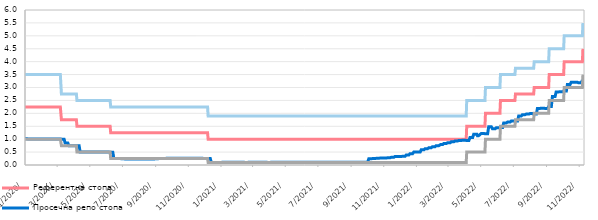
| Category | Референтна стопа | Просечна репо стопа | Каматна стопа на кредитне олакшице | Каматна стопа на депозитне олакшице |
|---|---|---|---|---|
| 2020-01-03 | 2.25 | 1.02 | 3.5 | 1 |
| 2020-01-06 | 2.25 | 1.02 | 3.5 | 1 |
| 2020-01-08 | 2.25 | 1.01 | 3.5 | 1 |
| 2020-01-09 | 2.25 | 1.01 | 3.5 | 1 |
| 2020-01-10 | 2.25 | 1.01 | 3.5 | 1 |
| 2020-01-13 | 2.25 | 1.01 | 3.5 | 1 |
| 2020-01-14 | 2.25 | 1.01 | 3.5 | 1 |
| 2020-01-15 | 2.25 | 1.01 | 3.5 | 1 |
| 2020-01-16 | 2.25 | 1.01 | 3.5 | 1 |
| 2020-01-17 | 2.25 | 1.01 | 3.5 | 1 |
| 2020-01-20 | 2.25 | 1.01 | 3.5 | 1 |
| 2020-01-21 | 2.25 | 1.01 | 3.5 | 1 |
| 2020-01-22 | 2.25 | 1.01 | 3.5 | 1 |
| 2020-01-23 | 2.25 | 1.01 | 3.5 | 1 |
| 2020-01-24 | 2.25 | 1.01 | 3.5 | 1 |
| 2020-01-27 | 2.25 | 1.01 | 3.5 | 1 |
| 2020-01-28 | 2.25 | 1.01 | 3.5 | 1 |
| 2020-01-29 | 2.25 | 1.01 | 3.5 | 1 |
| 2020-01-30 | 2.25 | 1.01 | 3.5 | 1 |
| 2020-01-31 | 2.25 | 1.01 | 3.5 | 1 |
| 2020-02-03 | 2.25 | 1.01 | 3.5 | 1 |
| 2020-02-04 | 2.25 | 1.01 | 3.5 | 1 |
| 2020-02-05 | 2.25 | 1.01 | 3.5 | 1 |
| 2020-02-06 | 2.25 | 1.01 | 3.5 | 1 |
| 2020-02-07 | 2.25 | 1.01 | 3.5 | 1 |
| 2020-02-10 | 2.25 | 1.01 | 3.5 | 1 |
| 2020-02-11 | 2.25 | 1.01 | 3.5 | 1 |
| 2020-02-12 | 2.25 | 1.01 | 3.5 | 1 |
| 2020-02-13 | 2.25 | 1.01 | 3.5 | 1 |
| 2020-02-14 | 2.25 | 1.01 | 3.5 | 1 |
| 2020-02-18 | 2.25 | 1.01 | 3.5 | 1 |
| 2020-02-19 | 2.25 | 1.01 | 3.5 | 1 |
| 2020-02-20 | 2.25 | 1.01 | 3.5 | 1 |
| 2020-02-21 | 2.25 | 1.01 | 3.5 | 1 |
| 2020-02-24 | 2.25 | 1.01 | 3.5 | 1 |
| 2020-02-25 | 2.25 | 1.01 | 3.5 | 1 |
| 2020-02-26 | 2.25 | 1.01 | 3.5 | 1 |
| 2020-02-27 | 2.25 | 1.01 | 3.5 | 1 |
| 2020-02-28 | 2.25 | 1.01 | 3.5 | 1 |
| 2020-03-02 | 2.25 | 1.01 | 3.5 | 1 |
| 2020-03-03 | 2.25 | 1.01 | 3.5 | 1 |
| 2020-03-04 | 2.25 | 1.01 | 3.5 | 1 |
| 2020-03-05 | 2.25 | 1.01 | 3.5 | 1 |
| 2020-03-06 | 2.25 | 1.01 | 3.5 | 1 |
| 2020-03-09 | 2.25 | 1.01 | 3.5 | 1 |
| 2020-03-10 | 2.25 | 1.01 | 3.5 | 1 |
| 2020-03-11 | 1.75 | 1 | 2.75 | 0.75 |
| 2020-03-12 | 1.75 | 1 | 2.75 | 0.75 |
| 2020-03-13 | 1.75 | 1 | 2.75 | 0.75 |
| 2020-03-16 | 1.75 | 1 | 2.75 | 0.75 |
| 2020-03-17 | 1.75 | 1 | 2.75 | 0.75 |
| 2020-03-18 | 1.75 | 0.85 | 2.75 | 0.75 |
| 2020-03-19 | 1.75 | 0.85 | 2.75 | 0.75 |
| 2020-03-20 | 1.75 | 0.85 | 2.75 | 0.75 |
| 2020-03-23 | 1.75 | 0.85 | 2.75 | 0.75 |
| 2020-03-24 | 1.75 | 0.85 | 2.75 | 0.75 |
| 2020-03-25 | 1.75 | 0.75 | 2.75 | 0.75 |
| 2020-03-26 | 1.75 | 0.75 | 2.75 | 0.75 |
| 2020-03-27 | 1.75 | 0.75 | 2.75 | 0.75 |
| 2020-03-30 | 1.75 | 0.75 | 2.75 | 0.75 |
| 2020-03-31 | 1.75 | 0.75 | 2.75 | 0.75 |
| 2020-04-01 | 1.75 | 0.75 | 2.75 | 0.75 |
| 2020-04-02 | 1.75 | 0.75 | 2.75 | 0.75 |
| 2020-04-03 | 1.75 | 0.75 | 2.75 | 0.75 |
| 2020-04-06 | 1.75 | 0.75 | 2.75 | 0.75 |
| 2020-04-07 | 1.75 | 0.75 | 2.75 | 0.75 |
| 2020-04-08 | 1.75 | 0.75 | 2.75 | 0.75 |
| 2020-04-09 | 1.5 | 0.75 | 2.5 | 0.5 |
| 2020-04-10 | 1.5 | 0.75 | 2.5 | 0.5 |
| 2020-04-13 | 1.5 | 0.75 | 2.5 | 0.5 |
| 2020-04-14 | 1.5 | 0.75 | 2.5 | 0.5 |
| 2020-04-15 | 1.5 | 0.5 | 2.5 | 0.5 |
| 2020-04-16 | 1.5 | 0.5 | 2.5 | 0.5 |
| 2020-04-21 | 1.5 | 0.5 | 2.5 | 0.5 |
| 2020-04-22 | 1.5 | 0.5 | 2.5 | 0.5 |
| 2020-04-23 | 1.5 | 0.5 | 2.5 | 0.5 |
| 2020-04-24 | 1.5 | 0.5 | 2.5 | 0.5 |
| 2020-04-27 | 1.5 | 0.5 | 2.5 | 0.5 |
| 2020-04-28 | 1.5 | 0.5 | 2.5 | 0.5 |
| 2020-04-29 | 1.5 | 0.5 | 2.5 | 0.5 |
| 2020-04-30 | 1.5 | 0.5 | 2.5 | 0.5 |
| 2020-05-04 | 1.5 | 0.5 | 2.5 | 0.5 |
| 2020-05-05 | 1.5 | 0.5 | 2.5 | 0.5 |
| 2020-05-06 | 1.5 | 0.5 | 2.5 | 0.5 |
| 2020-05-07 | 1.5 | 0.5 | 2.5 | 0.5 |
| 2020-05-08 | 1.5 | 0.5 | 2.5 | 0.5 |
| 2020-05-11 | 1.5 | 0.5 | 2.5 | 0.5 |
| 2020-05-12 | 1.5 | 0.5 | 2.5 | 0.5 |
| 2020-05-13 | 1.5 | 0.5 | 2.5 | 0.5 |
| 2020-05-14 | 1.5 | 0.5 | 2.5 | 0.5 |
| 2020-05-15 | 1.5 | 0.5 | 2.5 | 0.5 |
| 2020-05-18 | 1.5 | 0.5 | 2.5 | 0.5 |
| 2020-05-19 | 1.5 | 0.5 | 2.5 | 0.5 |
| 2020-05-20 | 1.5 | 0.5 | 2.5 | 0.5 |
| 2020-05-21 | 1.5 | 0.5 | 2.5 | 0.5 |
| 2020-05-22 | 1.5 | 0.5 | 2.5 | 0.5 |
| 2020-05-25 | 1.5 | 0.5 | 2.5 | 0.5 |
| 2020-05-26 | 1.5 | 0.5 | 2.5 | 0.5 |
| 2020-05-27 | 1.5 | 0.5 | 2.5 | 0.5 |
| 2020-05-28 | 1.5 | 0.5 | 2.5 | 0.5 |
| 2020-05-29 | 1.5 | 0.5 | 2.5 | 0.5 |
| 2020-06-01 | 1.5 | 0.5 | 2.5 | 0.5 |
| 2020-06-02 | 1.5 | 0.5 | 2.5 | 0.5 |
| 2020-06-03 | 1.5 | 0.5 | 2.5 | 0.5 |
| 2020-06-04 | 1.5 | 0.5 | 2.5 | 0.5 |
| 2020-06-05 | 1.5 | 0.5 | 2.5 | 0.5 |
| 2020-06-08 | 1.5 | 0.5 | 2.5 | 0.5 |
| 2020-06-09 | 1.5 | 0.5 | 2.5 | 0.5 |
| 2020-06-10 | 1.5 | 0.49 | 2.5 | 0.5 |
| 2020-06-11 | 1.25 | 0.49 | 2.25 | 0.25 |
| 2020-06-12 | 1.25 | 0.49 | 2.25 | 0.25 |
| 2020-06-15 | 1.25 | 0.49 | 2.25 | 0.25 |
| 2020-06-16 | 1.25 | 0.49 | 2.25 | 0.25 |
| 2020-06-17 | 1.25 | 0.25 | 2.25 | 0.25 |
| 2020-06-18 | 1.25 | 0.25 | 2.25 | 0.25 |
| 2020-06-19 | 1.25 | 0.25 | 2.25 | 0.25 |
| 2020-06-22 | 1.25 | 0.25 | 2.25 | 0.25 |
| 2020-06-23 | 1.25 | 0.25 | 2.25 | 0.25 |
| 2020-06-24 | 1.25 | 0.25 | 2.25 | 0.25 |
| 2020-06-25 | 1.25 | 0.25 | 2.25 | 0.25 |
| 2020-06-26 | 1.25 | 0.25 | 2.25 | 0.25 |
| 2020-06-29 | 1.25 | 0.25 | 2.25 | 0.25 |
| 2020-06-30 | 1.25 | 0.25 | 2.25 | 0.25 |
| 2020-07-01 | 1.25 | 0.24 | 2.25 | 0.25 |
| 2020-07-02 | 1.25 | 0.24 | 2.25 | 0.25 |
| 2020-07-03 | 1.25 | 0.24 | 2.25 | 0.25 |
| 2020-07-06 | 1.25 | 0.24 | 2.25 | 0.25 |
| 2020-07-07 | 1.25 | 0.24 | 2.25 | 0.25 |
| 2020-07-08 | 1.25 | 0.23 | 2.25 | 0.25 |
| 2020-07-09 | 1.25 | 0.23 | 2.25 | 0.25 |
| 2020-07-10 | 1.25 | 0.23 | 2.25 | 0.25 |
| 2020-07-13 | 1.25 | 0.23 | 2.25 | 0.25 |
| 2020-07-14 | 1.25 | 0.23 | 2.25 | 0.25 |
| 2020-07-15 | 1.25 | 0.23 | 2.25 | 0.25 |
| 2020-07-16 | 1.25 | 0.23 | 2.25 | 0.25 |
| 2020-07-17 | 1.25 | 0.23 | 2.25 | 0.25 |
| 2020-07-20 | 1.25 | 0.23 | 2.25 | 0.25 |
| 2020-07-21 | 1.25 | 0.23 | 2.25 | 0.25 |
| 2020-07-22 | 1.25 | 0.23 | 2.25 | 0.25 |
| 2020-07-23 | 1.25 | 0.23 | 2.25 | 0.25 |
| 2020-07-24 | 1.25 | 0.23 | 2.25 | 0.25 |
| 2020-07-27 | 1.25 | 0.23 | 2.25 | 0.25 |
| 2020-07-28 | 1.25 | 0.23 | 2.25 | 0.25 |
| 2020-07-29 | 1.25 | 0.23 | 2.25 | 0.25 |
| 2020-07-30 | 1.25 | 0.23 | 2.25 | 0.25 |
| 2020-07-31 | 1.25 | 0.23 | 2.25 | 0.25 |
| 2020-08-03 | 1.25 | 0.23 | 2.25 | 0.25 |
| 2020-08-04 | 1.25 | 0.23 | 2.25 | 0.25 |
| 2020-08-05 | 1.25 | 0.23 | 2.25 | 0.25 |
| 2020-08-06 | 1.25 | 0.23 | 2.25 | 0.25 |
| 2020-08-07 | 1.25 | 0.23 | 2.25 | 0.25 |
| 2020-08-10 | 1.25 | 0.23 | 2.25 | 0.25 |
| 2020-08-11 | 1.25 | 0.23 | 2.25 | 0.25 |
| 2020-08-12 | 1.25 | 0.23 | 2.25 | 0.25 |
| 2020-08-13 | 1.25 | 0.23 | 2.25 | 0.25 |
| 2020-08-14 | 1.25 | 0.23 | 2.25 | 0.25 |
| 2020-08-17 | 1.25 | 0.23 | 2.25 | 0.25 |
| 2020-08-18 | 1.25 | 0.23 | 2.25 | 0.25 |
| 2020-08-19 | 1.25 | 0.23 | 2.25 | 0.25 |
| 2020-08-20 | 1.25 | 0.23 | 2.25 | 0.25 |
| 2020-08-21 | 1.25 | 0.23 | 2.25 | 0.25 |
| 2020-08-24 | 1.25 | 0.23 | 2.25 | 0.25 |
| 2020-08-25 | 1.25 | 0.23 | 2.25 | 0.25 |
| 2020-08-26 | 1.25 | 0.23 | 2.25 | 0.25 |
| 2020-08-27 | 1.25 | 0.23 | 2.25 | 0.25 |
| 2020-08-28 | 1.25 | 0.23 | 2.25 | 0.25 |
| 2020-08-31 | 1.25 | 0.23 | 2.25 | 0.25 |
| 2020-09-01 | 1.25 | 0.23 | 2.25 | 0.25 |
| 2020-09-02 | 1.25 | 0.24 | 2.25 | 0.25 |
| 2020-09-03 | 1.25 | 0.24 | 2.25 | 0.25 |
| 2020-09-04 | 1.25 | 0.24 | 2.25 | 0.25 |
| 2020-09-07 | 1.25 | 0.24 | 2.25 | 0.25 |
| 2020-09-08 | 1.25 | 0.24 | 2.25 | 0.25 |
| 2020-09-09 | 1.25 | 0.25 | 2.25 | 0.25 |
| 2020-09-10 | 1.25 | 0.25 | 2.25 | 0.25 |
| 2020-09-11 | 1.25 | 0.25 | 2.25 | 0.25 |
| 2020-09-14 | 1.25 | 0.25 | 2.25 | 0.25 |
| 2020-09-15 | 1.25 | 0.25 | 2.25 | 0.25 |
| 2020-09-16 | 1.25 | 0.25 | 2.25 | 0.25 |
| 2020-09-17 | 1.25 | 0.25 | 2.25 | 0.25 |
| 2020-09-18 | 1.25 | 0.25 | 2.25 | 0.25 |
| 2020-09-21 | 1.25 | 0.25 | 2.25 | 0.25 |
| 2020-09-22 | 1.25 | 0.25 | 2.25 | 0.25 |
| 2020-09-23 | 1.25 | 0.26 | 2.25 | 0.25 |
| 2020-09-24 | 1.25 | 0.26 | 2.25 | 0.25 |
| 2020-09-25 | 1.25 | 0.26 | 2.25 | 0.25 |
| 2020-09-28 | 1.25 | 0.26 | 2.25 | 0.25 |
| 2020-09-29 | 1.25 | 0.26 | 2.25 | 0.25 |
| 2020-09-30 | 1.25 | 0.26 | 2.25 | 0.25 |
| 2020-10-01 | 1.25 | 0.26 | 2.25 | 0.25 |
| 2020-10-02 | 1.25 | 0.26 | 2.25 | 0.25 |
| 2020-10-05 | 1.25 | 0.26 | 2.25 | 0.25 |
| 2020-10-06 | 1.25 | 0.26 | 2.25 | 0.25 |
| 2020-10-07 | 1.25 | 0.26 | 2.25 | 0.25 |
| 2020-10-08 | 1.25 | 0.26 | 2.25 | 0.25 |
| 2020-10-09 | 1.25 | 0.26 | 2.25 | 0.25 |
| 2020-10-12 | 1.25 | 0.26 | 2.25 | 0.25 |
| 2020-10-13 | 1.25 | 0.26 | 2.25 | 0.25 |
| 2020-10-14 | 1.25 | 0.26 | 2.25 | 0.25 |
| 2020-10-15 | 1.25 | 0.26 | 2.25 | 0.25 |
| 2020-10-16 | 1.25 | 0.26 | 2.25 | 0.25 |
| 2020-10-19 | 1.25 | 0.26 | 2.25 | 0.25 |
| 2020-10-20 | 1.25 | 0.26 | 2.25 | 0.25 |
| 2020-10-21 | 1.25 | 0.26 | 2.25 | 0.25 |
| 2020-10-22 | 1.25 | 0.26 | 2.25 | 0.25 |
| 2020-10-23 | 1.25 | 0.26 | 2.25 | 0.25 |
| 2020-10-26 | 1.25 | 0.26 | 2.25 | 0.25 |
| 2020-10-27 | 1.25 | 0.26 | 2.25 | 0.25 |
| 2020-10-28 | 1.25 | 0.26 | 2.25 | 0.25 |
| 2020-10-29 | 1.25 | 0.26 | 2.25 | 0.25 |
| 2020-10-30 | 1.25 | 0.26 | 2.25 | 0.25 |
| 2020-11-02 | 1.25 | 0.26 | 2.25 | 0.25 |
| 2020-11-03 | 1.25 | 0.26 | 2.25 | 0.25 |
| 2020-11-04 | 1.25 | 0.26 | 2.25 | 0.25 |
| 2020-11-05 | 1.25 | 0.26 | 2.25 | 0.25 |
| 2020-11-06 | 1.25 | 0.26 | 2.25 | 0.25 |
| 2020-11-09 | 1.25 | 0.26 | 2.25 | 0.25 |
| 2020-11-10 | 1.25 | 0.26 | 2.25 | 0.25 |
| 2020-11-12 | 1.25 | 0.26 | 2.25 | 0.25 |
| 2020-11-13 | 1.25 | 0.26 | 2.25 | 0.25 |
| 2020-11-16 | 1.25 | 0.26 | 2.25 | 0.25 |
| 2020-11-17 | 1.25 | 0.26 | 2.25 | 0.25 |
| 2020-11-18 | 1.25 | 0.26 | 2.25 | 0.25 |
| 2020-11-19 | 1.25 | 0.26 | 2.25 | 0.25 |
| 2020-11-20 | 1.25 | 0.26 | 2.25 | 0.25 |
| 2020-11-23 | 1.25 | 0.26 | 2.25 | 0.25 |
| 2020-11-24 | 1.25 | 0.26 | 2.25 | 0.25 |
| 2020-11-25 | 1.25 | 0.26 | 2.25 | 0.25 |
| 2020-11-26 | 1.25 | 0.26 | 2.25 | 0.25 |
| 2020-11-27 | 1.25 | 0.26 | 2.25 | 0.25 |
| 2020-11-30 | 1.25 | 0.26 | 2.25 | 0.25 |
| 2020-12-01 | 1.25 | 0.26 | 2.25 | 0.25 |
| 2020-12-02 | 1.25 | 0.25 | 2.25 | 0.25 |
| 2020-12-03 | 1.25 | 0.25 | 2.25 | 0.25 |
| 2020-12-04 | 1.25 | 0.25 | 2.25 | 0.25 |
| 2020-12-07 | 1.25 | 0.25 | 2.25 | 0.25 |
| 2020-12-08 | 1.25 | 0.25 | 2.25 | 0.25 |
| 2020-12-09 | 1.25 | 0.25 | 2.25 | 0.25 |
| 2020-12-10 | 1 | 0.25 | 1.9 | 0.1 |
| 2020-12-11 | 1 | 0.25 | 1.9 | 0.1 |
| 2020-12-14 | 1 | 0.25 | 1.9 | 0.1 |
| 2020-12-15 | 1 | 0.25 | 1.9 | 0.1 |
| 2020-12-16 | 1 | 0.1 | 1.9 | 0.1 |
| 2020-12-17 | 1 | 0.1 | 1.9 | 0.1 |
| 2020-12-18 | 1 | 0.1 | 1.9 | 0.1 |
| 2020-12-21 | 1 | 0.1 | 1.9 | 0.1 |
| 2020-12-22 | 1 | 0.1 | 1.9 | 0.1 |
| 2020-12-23 | 1 | 0.1 | 1.9 | 0.1 |
| 2020-12-24 | 1 | 0.1 | 1.9 | 0.1 |
| 2020-12-25 | 1 | 0.1 | 1.9 | 0.1 |
| 2020-12-28 | 1 | 0.1 | 1.9 | 0.1 |
| 2020-12-29 | 1 | 0.1 | 1.9 | 0.1 |
| 2020-12-30 | 1 | 0.1 | 1.9 | 0.1 |
| 2020-12-31 | 1 | 0.1 | 1.9 | 0.1 |
| 2021-01-04 | 1 | 0.1 | 1.9 | 0.1 |
| 2021-01-05 | 1 | 0.1 | 1.9 | 0.1 |
| 2021-01-06 | 1 | 0.11 | 1.9 | 0.1 |
| 2021-01-08 | 1 | 0.11 | 1.9 | 0.1 |
| 2021-01-11 | 1 | 0.11 | 1.9 | 0.1 |
| 2021-01-12 | 1 | 0.11 | 1.9 | 0.1 |
| 2021-01-13 | 1 | 0.11 | 1.9 | 0.1 |
| 2021-01-14 | 1 | 0.11 | 1.9 | 0.1 |
| 2021-01-15 | 1 | 0.11 | 1.9 | 0.1 |
| 2021-01-18 | 1 | 0.11 | 1.9 | 0.1 |
| 2021-01-19 | 1 | 0.11 | 1.9 | 0.1 |
| 2021-01-20 | 1 | 0.11 | 1.9 | 0.1 |
| 2021-01-21 | 1 | 0.11 | 1.9 | 0.1 |
| 2021-01-22 | 1 | 0.11 | 1.9 | 0.1 |
| 2021-01-25 | 1 | 0.11 | 1.9 | 0.1 |
| 2021-01-26 | 1 | 0.11 | 1.9 | 0.1 |
| 2021-01-27 | 1 | 0.11 | 1.9 | 0.1 |
| 2021-01-28 | 1 | 0.11 | 1.9 | 0.1 |
| 2021-01-29 | 1 | 0.11 | 1.9 | 0.1 |
| 2021-02-01 | 1 | 0.11 | 1.9 | 0.1 |
| 2021-02-02 | 1 | 0.11 | 1.9 | 0.1 |
| 2021-02-03 | 1 | 0.11 | 1.9 | 0.1 |
| 2021-02-04 | 1 | 0.11 | 1.9 | 0.1 |
| 2021-02-05 | 1 | 0.11 | 1.9 | 0.1 |
| 2021-02-08 | 1 | 0.11 | 1.9 | 0.1 |
| 2021-02-09 | 1 | 0.11 | 1.9 | 0.1 |
| 2021-02-10 | 1 | 0.11 | 1.9 | 0.1 |
| 2021-02-11 | 1 | 0.11 | 1.9 | 0.1 |
| 2021-02-12 | 1 | 0.11 | 1.9 | 0.1 |
| 2021-02-17 | 1 | 0.1 | 1.9 | 0.1 |
| 2021-02-18 | 1 | 0.1 | 1.9 | 0.1 |
| 2021-02-19 | 1 | 0.1 | 1.9 | 0.1 |
| 2021-02-22 | 1 | 0.1 | 1.9 | 0.1 |
| 2021-02-23 | 1 | 0.1 | 1.9 | 0.1 |
| 2021-02-24 | 1 | 0.11 | 1.9 | 0.1 |
| 2021-02-25 | 1 | 0.11 | 1.9 | 0.1 |
| 2021-02-26 | 1 | 0.11 | 1.9 | 0.1 |
| 2021-03-01 | 1 | 0.11 | 1.9 | 0.1 |
| 2021-03-02 | 1 | 0.11 | 1.9 | 0.1 |
| 2021-03-03 | 1 | 0.11 | 1.9 | 0.1 |
| 2021-03-04 | 1 | 0.11 | 1.9 | 0.1 |
| 2021-03-05 | 1 | 0.11 | 1.9 | 0.1 |
| 2021-03-08 | 1 | 0.11 | 1.9 | 0.1 |
| 2021-03-09 | 1 | 0.11 | 1.9 | 0.1 |
| 2021-03-10 | 1 | 0.11 | 1.9 | 0.1 |
| 2021-03-11 | 1 | 0.11 | 1.9 | 0.1 |
| 2021-03-12 | 1 | 0.11 | 1.9 | 0.1 |
| 2021-03-15 | 1 | 0.11 | 1.9 | 0.1 |
| 2021-03-16 | 1 | 0.11 | 1.9 | 0.1 |
| 2021-03-17 | 1 | 0.11 | 1.9 | 0.1 |
| 2021-03-18 | 1 | 0.11 | 1.9 | 0.1 |
| 2021-03-19 | 1 | 0.11 | 1.9 | 0.1 |
| 2021-03-22 | 1 | 0.11 | 1.9 | 0.1 |
| 2021-03-23 | 1 | 0.11 | 1.9 | 0.1 |
| 2021-03-24 | 1 | 0.11 | 1.9 | 0.1 |
| 2021-03-25 | 1 | 0.11 | 1.9 | 0.1 |
| 2021-03-26 | 1 | 0.11 | 1.9 | 0.1 |
| 2021-03-29 | 1 | 0.11 | 1.9 | 0.1 |
| 2021-03-30 | 1 | 0.11 | 1.9 | 0.1 |
| 2021-03-31 | 1 | 0.1 | 1.9 | 0.1 |
| 2021-04-01 | 1 | 0.1 | 1.9 | 0.1 |
| 2021-04-02 | 1 | 0.1 | 1.9 | 0.1 |
| 2021-04-05 | 1 | 0.1 | 1.9 | 0.1 |
| 2021-04-06 | 1 | 0.1 | 1.9 | 0.1 |
| 2021-04-07 | 1 | 0.11 | 1.9 | 0.1 |
| 2021-04-08 | 1 | 0.11 | 1.9 | 0.1 |
| 2021-04-09 | 1 | 0.11 | 1.9 | 0.1 |
| 2021-04-12 | 1 | 0.11 | 1.9 | 0.1 |
| 2021-04-13 | 1 | 0.11 | 1.9 | 0.1 |
| 2021-04-14 | 1 | 0.11 | 1.9 | 0.1 |
| 2021-04-15 | 1 | 0.11 | 1.9 | 0.1 |
| 2021-04-16 | 1 | 0.11 | 1.9 | 0.1 |
| 2021-04-19 | 1 | 0.11 | 1.9 | 0.1 |
| 2021-04-20 | 1 | 0.11 | 1.9 | 0.1 |
| 2021-04-21 | 1 | 0.11 | 1.9 | 0.1 |
| 2021-04-22 | 1 | 0.11 | 1.9 | 0.1 |
| 2021-04-23 | 1 | 0.11 | 1.9 | 0.1 |
| 2021-04-26 | 1 | 0.11 | 1.9 | 0.1 |
| 2021-04-27 | 1 | 0.11 | 1.9 | 0.1 |
| 2021-04-28 | 1 | 0.11 | 1.9 | 0.1 |
| 2021-04-29 | 1 | 0.11 | 1.9 | 0.1 |
| 2021-05-05 | 1 | 0.11 | 1.9 | 0.1 |
| 2021-05-06 | 1 | 0.11 | 1.9 | 0.1 |
| 2021-05-07 | 1 | 0.11 | 1.9 | 0.1 |
| 2021-05-10 | 1 | 0.11 | 1.9 | 0.1 |
| 2021-05-11 | 1 | 0.11 | 1.9 | 0.1 |
| 2021-05-12 | 1 | 0.11 | 1.9 | 0.1 |
| 2021-05-13 | 1 | 0.11 | 1.9 | 0.1 |
| 2021-05-14 | 1 | 0.11 | 1.9 | 0.1 |
| 2021-05-17 | 1 | 0.11 | 1.9 | 0.1 |
| 2021-05-18 | 1 | 0.11 | 1.9 | 0.1 |
| 2021-05-19 | 1 | 0.11 | 1.9 | 0.1 |
| 2021-05-20 | 1 | 0.11 | 1.9 | 0.1 |
| 2021-05-21 | 1 | 0.11 | 1.9 | 0.1 |
| 2021-05-24 | 1 | 0.11 | 1.9 | 0.1 |
| 2021-05-25 | 1 | 0.11 | 1.9 | 0.1 |
| 2021-05-26 | 1 | 0.11 | 1.9 | 0.1 |
| 2021-05-27 | 1 | 0.11 | 1.9 | 0.1 |
| 2021-05-28 | 1 | 0.11 | 1.9 | 0.1 |
| 2021-05-31 | 1 | 0.11 | 1.9 | 0.1 |
| 2021-06-01 | 1 | 0.11 | 1.9 | 0.1 |
| 2021-06-02 | 1 | 0.11 | 1.9 | 0.1 |
| 2021-06-03 | 1 | 0.11 | 1.9 | 0.1 |
| 2021-06-04 | 1 | 0.11 | 1.9 | 0.1 |
| 2021-06-07 | 1 | 0.11 | 1.9 | 0.1 |
| 2021-06-08 | 1 | 0.11 | 1.9 | 0.1 |
| 2021-06-09 | 1 | 0.11 | 1.9 | 0.1 |
| 2021-06-10 | 1 | 0.11 | 1.9 | 0.1 |
| 2021-06-11 | 1 | 0.11 | 1.9 | 0.1 |
| 2021-06-14 | 1 | 0.11 | 1.9 | 0.1 |
| 2021-06-15 | 1 | 0.11 | 1.9 | 0.1 |
| 2021-06-16 | 1 | 0.11 | 1.9 | 0.1 |
| 2021-06-17 | 1 | 0.11 | 1.9 | 0.1 |
| 2021-06-18 | 1 | 0.11 | 1.9 | 0.1 |
| 2021-06-21 | 1 | 0.11 | 1.9 | 0.1 |
| 2021-06-22 | 1 | 0.11 | 1.9 | 0.1 |
| 2021-06-23 | 1 | 0.11 | 1.9 | 0.1 |
| 2021-06-24 | 1 | 0.11 | 1.9 | 0.1 |
| 2021-06-25 | 1 | 0.11 | 1.9 | 0.1 |
| 2021-06-28 | 1 | 0.11 | 1.9 | 0.1 |
| 2021-06-29 | 1 | 0.11 | 1.9 | 0.1 |
| 2021-06-30 | 1 | 0.11 | 1.9 | 0.1 |
| 2021-07-01 | 1 | 0.11 | 1.9 | 0.1 |
| 2021-07-02 | 1 | 0.11 | 1.9 | 0.1 |
| 2021-07-05 | 1 | 0.11 | 1.9 | 0.1 |
| 2021-07-06 | 1 | 0.11 | 1.9 | 0.1 |
| 2021-07-07 | 1 | 0.11 | 1.9 | 0.1 |
| 2021-07-08 | 1 | 0.11 | 1.9 | 0.1 |
| 2021-07-09 | 1 | 0.11 | 1.9 | 0.1 |
| 2021-07-12 | 1 | 0.11 | 1.9 | 0.1 |
| 2021-07-13 | 1 | 0.11 | 1.9 | 0.1 |
| 2021-07-14 | 1 | 0.11 | 1.9 | 0.1 |
| 2021-07-15 | 1 | 0.11 | 1.9 | 0.1 |
| 2021-07-16 | 1 | 0.11 | 1.9 | 0.1 |
| 2021-07-19 | 1 | 0.11 | 1.9 | 0.1 |
| 2021-07-20 | 1 | 0.11 | 1.9 | 0.1 |
| 2021-07-21 | 1 | 0.11 | 1.9 | 0.1 |
| 2021-07-22 | 1 | 0.11 | 1.9 | 0.1 |
| 2021-07-23 | 1 | 0.11 | 1.9 | 0.1 |
| 2021-07-26 | 1 | 0.11 | 1.9 | 0.1 |
| 2021-07-27 | 1 | 0.11 | 1.9 | 0.1 |
| 2021-07-28 | 1 | 0.11 | 1.9 | 0.1 |
| 2021-07-29 | 1 | 0.11 | 1.9 | 0.1 |
| 2021-07-30 | 1 | 0.11 | 1.9 | 0.1 |
| 2021-08-02 | 1 | 0.11 | 1.9 | 0.1 |
| 2021-08-03 | 1 | 0.11 | 1.9 | 0.1 |
| 2021-08-04 | 1 | 0.11 | 1.9 | 0.1 |
| 2021-08-05 | 1 | 0.11 | 1.9 | 0.1 |
| 2021-08-06 | 1 | 0.11 | 1.9 | 0.1 |
| 2021-08-09 | 1 | 0.11 | 1.9 | 0.1 |
| 2021-08-10 | 1 | 0.11 | 1.9 | 0.1 |
| 2021-08-11 | 1 | 0.11 | 1.9 | 0.1 |
| 2021-08-12 | 1 | 0.11 | 1.9 | 0.1 |
| 2021-08-13 | 1 | 0.11 | 1.9 | 0.1 |
| 2021-08-16 | 1 | 0.11 | 1.9 | 0.1 |
| 2021-08-17 | 1 | 0.11 | 1.9 | 0.1 |
| 2021-08-18 | 1 | 0.11 | 1.9 | 0.1 |
| 2021-08-19 | 1 | 0.11 | 1.9 | 0.1 |
| 2021-08-20 | 1 | 0.11 | 1.9 | 0.1 |
| 2021-08-23 | 1 | 0.11 | 1.9 | 0.1 |
| 2021-08-24 | 1 | 0.11 | 1.9 | 0.1 |
| 2021-08-25 | 1 | 0.11 | 1.9 | 0.1 |
| 2021-08-26 | 1 | 0.11 | 1.9 | 0.1 |
| 2021-08-27 | 1 | 0.11 | 1.9 | 0.1 |
| 2021-08-30 | 1 | 0.11 | 1.9 | 0.1 |
| 2021-08-31 | 1 | 0.11 | 1.9 | 0.1 |
| 2021-09-01 | 1 | 0.11 | 1.9 | 0.1 |
| 2021-09-02 | 1 | 0.11 | 1.9 | 0.1 |
| 2021-09-03 | 1 | 0.11 | 1.9 | 0.1 |
| 2021-09-06 | 1 | 0.11 | 1.9 | 0.1 |
| 2021-09-07 | 1 | 0.11 | 1.9 | 0.1 |
| 2021-09-08 | 1 | 0.11 | 1.9 | 0.1 |
| 2021-09-09 | 1 | 0.11 | 1.9 | 0.1 |
| 2021-09-10 | 1 | 0.11 | 1.9 | 0.1 |
| 2021-09-13 | 1 | 0.11 | 1.9 | 0.1 |
| 2021-09-14 | 1 | 0.11 | 1.9 | 0.1 |
| 2021-09-15 | 1 | 0.11 | 1.9 | 0.1 |
| 2021-09-16 | 1 | 0.11 | 1.9 | 0.1 |
| 2021-09-17 | 1 | 0.11 | 1.9 | 0.1 |
| 2021-09-20 | 1 | 0.11 | 1.9 | 0.1 |
| 2021-09-21 | 1 | 0.11 | 1.9 | 0.1 |
| 2021-09-22 | 1 | 0.11 | 1.9 | 0.1 |
| 2021-09-23 | 1 | 0.11 | 1.9 | 0.1 |
| 2021-09-24 | 1 | 0.11 | 1.9 | 0.1 |
| 2021-09-27 | 1 | 0.11 | 1.9 | 0.1 |
| 2021-09-28 | 1 | 0.11 | 1.9 | 0.1 |
| 2021-09-29 | 1 | 0.11 | 1.9 | 0.1 |
| 2021-09-30 | 1 | 0.11 | 1.9 | 0.1 |
| 2021-10-01 | 1 | 0.11 | 1.9 | 0.1 |
| 2021-10-04 | 1 | 0.11 | 1.9 | 0.1 |
| 2021-10-05 | 1 | 0.11 | 1.9 | 0.1 |
| 2021-10-06 | 1 | 0.24 | 1.9 | 0.1 |
| 2021-10-07 | 1 | 0.24 | 1.9 | 0.1 |
| 2021-10-08 | 1 | 0.24 | 1.9 | 0.1 |
| 2021-10-11 | 1 | 0.24 | 1.9 | 0.1 |
| 2021-10-12 | 1 | 0.24 | 1.9 | 0.1 |
| 2021-10-13 | 1 | 0.25 | 1.9 | 0.1 |
| 2021-10-14 | 1 | 0.25 | 1.9 | 0.1 |
| 2021-10-15 | 1 | 0.25 | 1.9 | 0.1 |
| 2021-10-18 | 1 | 0.25 | 1.9 | 0.1 |
| 2021-10-19 | 1 | 0.25 | 1.9 | 0.1 |
| 2021-10-20 | 1 | 0.26 | 1.9 | 0.1 |
| 2021-10-21 | 1 | 0.26 | 1.9 | 0.1 |
| 2021-10-22 | 1 | 0.26 | 1.9 | 0.1 |
| 2021-10-25 | 1 | 0.26 | 1.9 | 0.1 |
| 2021-10-26 | 1 | 0.26 | 1.9 | 0.1 |
| 2021-10-27 | 1 | 0.27 | 1.9 | 0.1 |
| 2021-10-28 | 1 | 0.27 | 1.9 | 0.1 |
| 2021-10-29 | 1 | 0.27 | 1.9 | 0.1 |
| 2021-11-01 | 1 | 0.27 | 1.9 | 0.1 |
| 2021-11-02 | 1 | 0.27 | 1.9 | 0.1 |
| 2021-11-03 | 1 | 0.27 | 1.9 | 0.1 |
| 2021-11-04 | 1 | 0.27 | 1.9 | 0.1 |
| 2021-11-05 | 1 | 0.27 | 1.9 | 0.1 |
| 2021-11-08 | 1 | 0.27 | 1.9 | 0.1 |
| 2021-11-09 | 1 | 0.27 | 1.9 | 0.1 |
| 2021-11-10 | 1 | 0.28 | 1.9 | 0.1 |
| 2021-11-12 | 1 | 0.28 | 1.9 | 0.1 |
| 2021-11-15 | 1 | 0.28 | 1.9 | 0.1 |
| 2021-11-16 | 1 | 0.28 | 1.9 | 0.1 |
| 2021-11-17 | 1 | 0.3 | 1.9 | 0.1 |
| 2021-11-18 | 1 | 0.3 | 1.9 | 0.1 |
| 2021-11-19 | 1 | 0.3 | 1.9 | 0.1 |
| 2021-11-22 | 1 | 0.3 | 1.9 | 0.1 |
| 2021-11-23 | 1 | 0.3 | 1.9 | 0.1 |
| 2021-11-24 | 1 | 0.33 | 1.9 | 0.1 |
| 2021-11-25 | 1 | 0.33 | 1.9 | 0.1 |
| 2021-11-26 | 1 | 0.33 | 1.9 | 0.1 |
| 2021-11-29 | 1 | 0.33 | 1.9 | 0.1 |
| 2021-11-30 | 1 | 0.33 | 1.9 | 0.1 |
| 2021-12-01 | 1 | 0.33 | 1.9 | 0.1 |
| 2021-12-02 | 1 | 0.33 | 1.9 | 0.1 |
| 2021-12-03 | 1 | 0.33 | 1.9 | 0.1 |
| 2021-12-06 | 1 | 0.33 | 1.9 | 0.1 |
| 2021-12-07 | 1 | 0.33 | 1.9 | 0.1 |
| 2021-12-08 | 1 | 0.34 | 1.9 | 0.1 |
| 2021-12-09 | 1 | 0.34 | 1.9 | 0.1 |
| 2021-12-10 | 1 | 0.34 | 1.9 | 0.1 |
| 2021-12-13 | 1 | 0.34 | 1.9 | 0.1 |
| 2021-12-14 | 1 | 0.34 | 1.9 | 0.1 |
| 2021-12-15 | 1 | 0.39 | 1.9 | 0.1 |
| 2021-12-16 | 1 | 0.39 | 1.9 | 0.1 |
| 2021-12-17 | 1 | 0.39 | 1.9 | 0.1 |
| 2021-12-20 | 1 | 0.39 | 1.9 | 0.1 |
| 2021-12-21 | 1 | 0.39 | 1.9 | 0.1 |
| 2021-12-22 | 1 | 0.44 | 1.9 | 0.1 |
| 2021-12-23 | 1 | 0.44 | 1.9 | 0.1 |
| 2021-12-24 | 1 | 0.44 | 1.9 | 0.1 |
| 2021-12-27 | 1 | 0.44 | 1.9 | 0.1 |
| 2021-12-28 | 1 | 0.44 | 1.9 | 0.1 |
| 2021-12-29 | 1 | 0.5 | 1.9 | 0.1 |
| 2021-12-30 | 1 | 0.5 | 1.9 | 0.1 |
| 2021-12-31 | 1 | 0.5 | 1.9 | 0.1 |
| 2022-01-04 | 1 | 0.5 | 1.9 | 0.1 |
| 2022-01-05 | 1 | 0.5 | 1.9 | 0.1 |
| 2022-01-06 | 1 | 0.5 | 1.9 | 0.1 |
| 2022-01-10 | 1 | 0.5 | 1.9 | 0.1 |
| 2022-01-11 | 1 | 0.5 | 1.9 | 0.1 |
| 2022-01-12 | 1 | 0.59 | 1.9 | 0.1 |
| 2022-01-13 | 1 | 0.59 | 1.9 | 0.1 |
| 2022-01-14 | 1 | 0.59 | 1.9 | 0.1 |
| 2022-01-17 | 1 | 0.59 | 1.9 | 0.1 |
| 2022-01-18 | 1 | 0.59 | 1.9 | 0.1 |
| 2022-01-19 | 1 | 0.63 | 1.9 | 0.1 |
| 2022-01-20 | 1 | 0.63 | 1.9 | 0.1 |
| 2022-01-21 | 1 | 0.63 | 1.9 | 0.1 |
| 2022-01-24 | 1 | 0.63 | 1.9 | 0.1 |
| 2022-01-25 | 1 | 0.63 | 1.9 | 0.1 |
| 2022-01-26 | 1 | 0.67 | 1.9 | 0.1 |
| 2022-01-27 | 1 | 0.67 | 1.9 | 0.1 |
| 2022-01-28 | 1 | 0.67 | 1.9 | 0.1 |
| 2022-01-31 | 1 | 0.67 | 1.9 | 0.1 |
| 2022-02-01 | 1 | 0.67 | 1.9 | 0.1 |
| 2022-02-02 | 1 | 0.71 | 1.9 | 0.1 |
| 2022-02-03 | 1 | 0.71 | 1.9 | 0.1 |
| 2022-02-04 | 1 | 0.71 | 1.9 | 0.1 |
| 2022-02-07 | 1 | 0.71 | 1.9 | 0.1 |
| 2022-02-08 | 1 | 0.71 | 1.9 | 0.1 |
| 2022-02-09 | 1 | 0.75 | 1.9 | 0.1 |
| 2022-02-10 | 1 | 0.75 | 1.9 | 0.1 |
| 2022-02-11 | 1 | 0.75 | 1.9 | 0.1 |
| 2022-02-14 | 1 | 0.75 | 1.9 | 0.1 |
| 2022-02-17 | 1 | 0.79 | 1.9 | 0.1 |
| 2022-02-18 | 1 | 0.79 | 1.9 | 0.1 |
| 2022-02-21 | 1 | 0.79 | 1.9 | 0.1 |
| 2022-02-22 | 1 | 0.79 | 1.9 | 0.1 |
| 2022-02-23 | 1 | 0.83 | 1.9 | 0.1 |
| 2022-02-24 | 1 | 0.83 | 1.9 | 0.1 |
| 2022-02-25 | 1 | 0.83 | 1.9 | 0.1 |
| 2022-02-28 | 1 | 0.83 | 1.9 | 0.1 |
| 2022-03-01 | 1 | 0.83 | 1.9 | 0.1 |
| 2022-03-02 | 1 | 0.86 | 1.9 | 0.1 |
| 2022-03-03 | 1 | 0.86 | 1.9 | 0.1 |
| 2022-03-04 | 1 | 0.86 | 1.9 | 0.1 |
| 2022-03-07 | 1 | 0.86 | 1.9 | 0.1 |
| 2022-03-08 | 1 | 0.86 | 1.9 | 0.1 |
| 2022-03-09 | 1 | 0.9 | 1.9 | 0.1 |
| 2022-03-10 | 1 | 0.9 | 1.9 | 0.1 |
| 2022-03-11 | 1 | 0.9 | 1.9 | 0.1 |
| 2022-03-14 | 1 | 0.9 | 1.9 | 0.1 |
| 2022-03-15 | 1 | 0.9 | 1.9 | 0.1 |
| 2022-03-16 | 1 | 0.93 | 1.9 | 0.1 |
| 2022-03-17 | 1 | 0.93 | 1.9 | 0.1 |
| 2022-03-18 | 1 | 0.93 | 1.9 | 0.1 |
| 2022-03-21 | 1 | 0.93 | 1.9 | 0.1 |
| 2022-03-22 | 1 | 0.93 | 1.9 | 0.1 |
| 2022-03-23 | 1 | 0.95 | 1.9 | 0.1 |
| 2022-03-24 | 1 | 0.95 | 1.9 | 0.1 |
| 2022-03-25 | 1 | 0.95 | 1.9 | 0.1 |
| 2022-03-28 | 1 | 0.95 | 1.9 | 0.1 |
| 2022-03-29 | 1 | 0.95 | 1.9 | 0.1 |
| 2022-03-30 | 1 | 0.96 | 1.9 | 0.1 |
| 2022-03-31 | 1 | 0.96 | 1.9 | 0.1 |
| 2022-04-01 | 1 | 0.96 | 1.9 | 0.1 |
| 2022-04-04 | 1 | 0.96 | 1.9 | 0.1 |
| 2022-04-05 | 1 | 0.96 | 1.9 | 0.1 |
| 2022-04-06 | 1 | 0.95 | 1.9 | 0.1 |
| 2022-04-07 | 1.5 | 0.95 | 2.5 | 0.5 |
| 2022-04-08 | 1.5 | 0.95 | 2.5 | 0.5 |
| 2022-04-11 | 1.5 | 0.95 | 2.5 | 0.5 |
| 2022-04-12 | 1.5 | 0.95 | 2.5 | 0.5 |
| 2022-04-13 | 1.5 | 1.06 | 2.5 | 0.5 |
| 2022-04-14 | 1.5 | 1.06 | 2.5 | 0.5 |
| 2022-04-15 | 1.5 | 1.06 | 2.5 | 0.5 |
| 2022-04-18 | 1.5 | 1.06 | 2.5 | 0.5 |
| 2022-04-19 | 1.5 | 1.06 | 2.5 | 0.5 |
| 2022-04-20 | 1.5 | 1.19 | 2.5 | 0.5 |
| 2022-04-21 | 1.5 | 1.19 | 2.5 | 0.5 |
| 2022-04-26 | 1.5 | 1.19 | 2.5 | 0.5 |
| 2022-04-27 | 1.5 | 1.13 | 2.5 | 0.5 |
| 2022-04-28 | 1.5 | 1.13 | 2.5 | 0.5 |
| 2022-04-29 | 1.5 | 1.13 | 2.5 | 0.5 |
| 2022-05-04 | 1.5 | 1.22 | 2.5 | 0.5 |
| 2022-05-05 | 1.5 | 1.22 | 2.5 | 0.5 |
| 2022-05-06 | 1.5 | 1.22 | 2.5 | 0.5 |
| 2022-05-09 | 1.5 | 1.22 | 2.5 | 0.5 |
| 2022-05-10 | 1.5 | 1.22 | 2.5 | 0.5 |
| 2022-05-11 | 1.5 | 1.21 | 2.5 | 0.5 |
| 2022-05-12 | 2 | 1.21 | 3 | 1 |
| 2022-05-13 | 2 | 1.21 | 3 | 1 |
| 2022-05-16 | 2 | 1.21 | 3 | 1 |
| 2022-05-17 | 2 | 1.21 | 3 | 1 |
| 2022-05-18 | 2 | 1.48 | 3 | 1 |
| 2022-05-19 | 2 | 1.48 | 3 | 1 |
| 2022-05-20 | 2 | 1.48 | 3 | 1 |
| 2022-05-23 | 2 | 1.48 | 3 | 1 |
| 2022-05-24 | 2 | 1.48 | 3 | 1 |
| 2022-05-25 | 2 | 1.4 | 3 | 1 |
| 2022-05-26 | 2 | 1.4 | 3 | 1 |
| 2022-05-27 | 2 | 1.4 | 3 | 1 |
| 2022-05-30 | 2 | 1.4 | 3 | 1 |
| 2022-05-31 | 2 | 1.4 | 3 | 1 |
| 2022-06-01 | 2 | 1.44 | 3 | 1 |
| 2022-06-02 | 2 | 1.44 | 3 | 1 |
| 2022-06-03 | 2 | 1.44 | 3 | 1 |
| 2022-06-06 | 2 | 1.44 | 3 | 1 |
| 2022-06-07 | 2 | 1.44 | 3 | 1 |
| 2022-06-08 | 2 | 1.45 | 3 | 1 |
| 2022-06-09 | 2.5 | 1.45 | 3.5 | 1.5 |
| 2022-06-10 | 2.5 | 1.45 | 3.5 | 1.5 |
| 2022-06-13 | 2.5 | 1.45 | 3.5 | 1.5 |
| 2022-06-14 | 2.5 | 1.45 | 3.5 | 1.5 |
| 2022-06-15 | 2.5 | 1.63 | 3.5 | 1.5 |
| 2022-06-16 | 2.5 | 1.63 | 3.5 | 1.5 |
| 2022-06-17 | 2.5 | 1.63 | 3.5 | 1.5 |
| 2022-06-20 | 2.5 | 1.63 | 3.5 | 1.5 |
| 2022-06-21 | 2.5 | 1.63 | 3.5 | 1.5 |
| 2022-06-22 | 2.5 | 1.66 | 3.5 | 1.5 |
| 2022-06-23 | 2.5 | 1.66 | 3.5 | 1.5 |
| 2022-06-24 | 2.5 | 1.66 | 3.5 | 1.5 |
| 2022-06-27 | 2.5 | 1.66 | 3.5 | 1.5 |
| 2022-06-28 | 2.5 | 1.66 | 3.5 | 1.5 |
| 2022-06-29 | 2.5 | 1.7 | 3.5 | 1.5 |
| 2022-06-30 | 2.5 | 1.7 | 3.5 | 1.5 |
| 2022-07-01 | 2.5 | 1.7 | 3.5 | 1.5 |
| 2022-07-04 | 2.5 | 1.7 | 3.5 | 1.5 |
| 2022-07-05 | 2.5 | 1.7 | 3.5 | 1.5 |
| 2022-07-06 | 2.5 | 1.7 | 3.5 | 1.5 |
| 2022-07-07 | 2.75 | 1.7 | 3.75 | 1.75 |
| 2022-07-08 | 2.75 | 1.7 | 3.75 | 1.75 |
| 2022-07-11 | 2.75 | 1.7 | 3.75 | 1.75 |
| 2022-07-12 | 2.75 | 1.7 | 3.75 | 1.75 |
| 2022-07-13 | 2.75 | 1.9 | 3.75 | 1.75 |
| 2022-07-14 | 2.75 | 1.9 | 3.75 | 1.75 |
| 2022-07-15 | 2.75 | 1.9 | 3.75 | 1.75 |
| 2022-07-18 | 2.75 | 1.9 | 3.75 | 1.75 |
| 2022-07-19 | 2.75 | 1.9 | 3.75 | 1.75 |
| 2022-07-20 | 2.75 | 1.95 | 3.75 | 1.75 |
| 2022-07-21 | 2.75 | 1.95 | 3.75 | 1.75 |
| 2022-07-22 | 2.75 | 1.95 | 3.75 | 1.75 |
| 2022-07-25 | 2.75 | 1.95 | 3.75 | 1.75 |
| 2022-07-26 | 2.75 | 1.95 | 3.75 | 1.75 |
| 2022-07-27 | 2.75 | 1.97 | 3.75 | 1.75 |
| 2022-07-28 | 2.75 | 1.97 | 3.75 | 1.75 |
| 2022-07-29 | 2.75 | 1.97 | 3.75 | 1.75 |
| 2022-08-01 | 2.75 | 1.97 | 3.75 | 1.75 |
| 2022-08-02 | 2.75 | 1.97 | 3.75 | 1.75 |
| 2022-08-03 | 2.75 | 1.99 | 3.75 | 1.75 |
| 2022-08-04 | 2.75 | 1.99 | 3.75 | 1.75 |
| 2022-08-05 | 2.75 | 1.99 | 3.75 | 1.75 |
| 2022-08-08 | 2.75 | 1.99 | 3.75 | 1.75 |
| 2022-08-09 | 2.75 | 1.99 | 3.75 | 1.75 |
| 2022-08-10 | 2.75 | 1.97 | 3.75 | 1.75 |
| 2022-08-11 | 3 | 1.97 | 4 | 2 |
| 2022-08-12 | 3 | 1.97 | 4 | 2 |
| 2022-08-15 | 3 | 1.97 | 4 | 2 |
| 2022-08-16 | 3 | 1.97 | 4 | 2 |
| 2022-08-17 | 3 | 2.19 | 4 | 2 |
| 2022-08-18 | 3 | 2.19 | 4 | 2 |
| 2022-08-19 | 3 | 2.19 | 4 | 2 |
| 2022-08-22 | 3 | 2.19 | 4 | 2 |
| 2022-08-23 | 3 | 2.19 | 4 | 2 |
| 2022-08-24 | 3 | 2.2 | 4 | 2 |
| 2022-08-25 | 3 | 2.2 | 4 | 2 |
| 2022-08-26 | 3 | 2.2 | 4 | 2 |
| 2022-08-29 | 3 | 2.2 | 4 | 2 |
| 2022-08-30 | 3 | 2.2 | 4 | 2 |
| 2022-08-31 | 3 | 2.19 | 4 | 2 |
| 2022-09-01 | 3 | 2.19 | 4 | 2 |
| 2022-09-02 | 3 | 2.19 | 4 | 2 |
| 2022-09-05 | 3 | 2.19 | 4 | 2 |
| 2022-09-06 | 3 | 2.19 | 4 | 2 |
| 2022-09-07 | 3 | 2.26 | 4 | 2 |
| 2022-09-08 | 3.5 | 2.26 | 4.5 | 2.5 |
| 2022-09-09 | 3.5 | 2.26 | 4.5 | 2.5 |
| 2022-09-12 | 3.5 | 2.26 | 4.5 | 2.5 |
| 2022-09-13 | 3.5 | 2.26 | 4.5 | 2.5 |
| 2022-09-14 | 3.5 | 2.65 | 4.5 | 2.5 |
| 2022-09-15 | 3.5 | 2.65 | 4.5 | 2.5 |
| 2022-09-16 | 3.5 | 2.65 | 4.5 | 2.5 |
| 2022-09-19 | 3.5 | 2.65 | 4.5 | 2.5 |
| 2022-09-20 | 3.5 | 2.65 | 4.5 | 2.5 |
| 2022-09-21 | 3.5 | 2.83 | 4.5 | 2.5 |
| 2022-09-22 | 3.5 | 2.83 | 4.5 | 2.5 |
| 2022-09-23 | 3.5 | 2.83 | 4.5 | 2.5 |
| 2022-09-26 | 3.5 | 2.83 | 4.5 | 2.5 |
| 2022-09-27 | 3.5 | 2.83 | 4.5 | 2.5 |
| 2022-09-28 | 3.5 | 2.84 | 4.5 | 2.5 |
| 2022-09-29 | 3.5 | 2.84 | 4.5 | 2.5 |
| 2022-09-30 | 3.5 | 2.84 | 4.5 | 2.5 |
| 2022-10-03 | 3.5 | 2.84 | 4.5 | 2.5 |
| 2022-10-04 | 3.5 | 2.84 | 4.5 | 2.5 |
| 2022-10-05 | 3.5 | 2.86 | 4.5 | 2.5 |
| 2022-10-06 | 4 | 2.86 | 5 | 3 |
| 2022-10-07 | 4 | 2.86 | 5 | 3 |
| 2022-10-10 | 4 | 2.86 | 5 | 3 |
| 2022-10-11 | 4 | 2.86 | 5 | 3 |
| 2022-10-12 | 4 | 3.12 | 5 | 3 |
| 2022-10-13 | 4 | 3.12 | 5 | 3 |
| 2022-10-14 | 4 | 3.12 | 5 | 3 |
| 2022-10-17 | 4 | 3.12 | 5 | 3 |
| 2022-10-18 | 4 | 3.12 | 5 | 3 |
| 2022-10-19 | 4 | 3.2 | 5 | 3 |
| 2022-10-20 | 4 | 3.2 | 5 | 3 |
| 2022-10-21 | 4 | 3.2 | 5 | 3 |
| 2022-10-24 | 4 | 3.2 | 5 | 3 |
| 2022-10-25 | 4 | 3.2 | 5 | 3 |
| 2022-10-26 | 4 | 3.2 | 5 | 3 |
| 2022-10-27 | 4 | 3.2 | 5 | 3 |
| 2022-10-28 | 4 | 3.2 | 5 | 3 |
| 2022-10-31 | 4 | 3.2 | 5 | 3 |
| 2022-11-01 | 4 | 3.2 | 5 | 3 |
| 2022-11-02 | 4 | 3.18 | 5 | 3 |
| 2022-11-03 | 4 | 3.18 | 5 | 3 |
| 2022-11-04 | 4 | 3.18 | 5 | 3 |
| 2022-11-07 | 4 | 3.18 | 5 | 3 |
| 2022-11-08 | 4 | 3.18 | 5 | 3 |
| 2022-11-09 | 4 | 3.29 | 5 | 3 |
| 2022-11-10 | 4.5 | 3.29 | 5.5 | 3.5 |